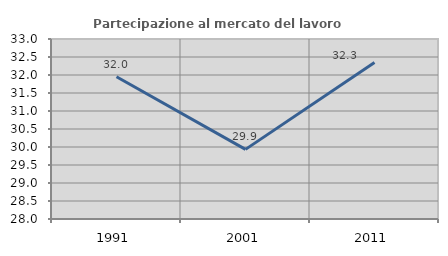
| Category | Partecipazione al mercato del lavoro  femminile |
|---|---|
| 1991.0 | 31.951 |
| 2001.0 | 29.934 |
| 2011.0 | 32.346 |